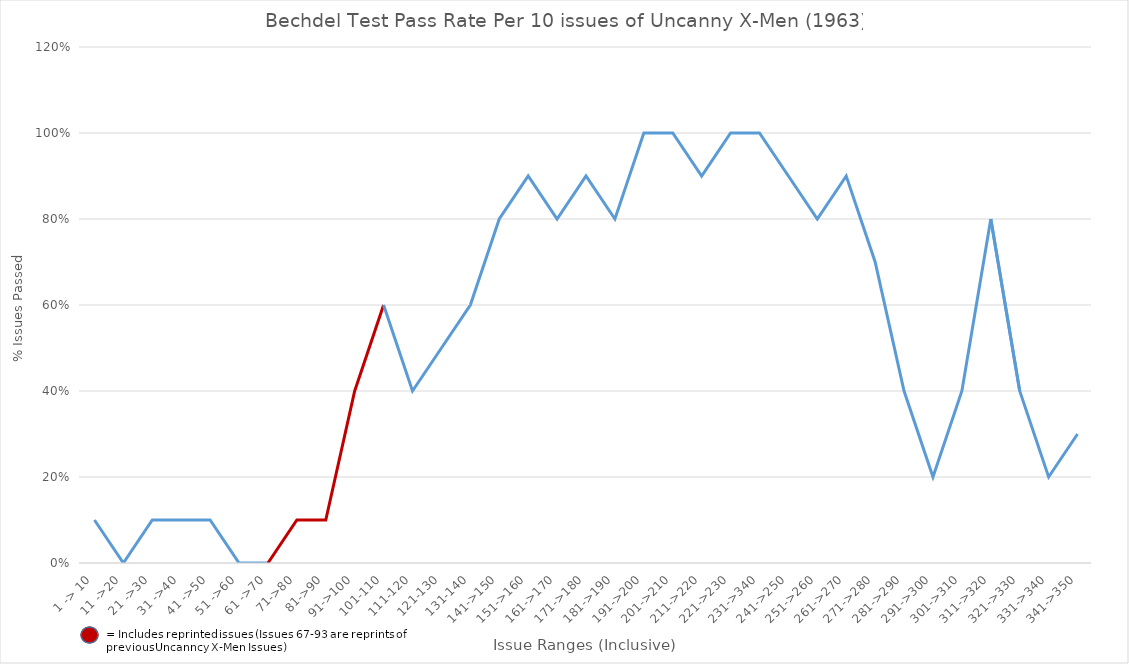
| Category | Every 10 issues pass #  (out of 10) |
|---|---|
| 1 -> 10 | 0.1 |
| 11 ->20 | 0 |
| 21 ->30 | 0.1 |
| 31 ->40 | 0.1 |
| 41 ->50 | 0.1 |
| 51 ->60 | 0 |
| 61 ->70 | 0 |
| 71->80 | 0.1 |
| 81->90 | 0.1 |
| 91->100 | 0.4 |
| 101-110 | 0.6 |
| 111-120 | 0.4 |
| 121-130 | 0.5 |
| 131-140 | 0.6 |
| 141->150 | 0.8 |
| 151->160 | 0.9 |
| 161->170 | 0.8 |
| 171->180 | 0.9 |
| 181->190 | 0.8 |
| 191->200 | 1 |
| 201->210 | 1 |
| 211->220 | 0.9 |
| 221->230 | 1 |
| 231->340 | 1 |
| 241->250 | 0.9 |
| 251->260 | 0.8 |
| 261->270 | 0.9 |
| 271->280 | 0.7 |
| 281->290 | 0.4 |
| 291->300 | 0.2 |
| 301->310 | 0.4 |
| 311->320 | 0.8 |
| 321->330 | 0.4 |
| 331->340 | 0.2 |
| 341->350 | 0.3 |